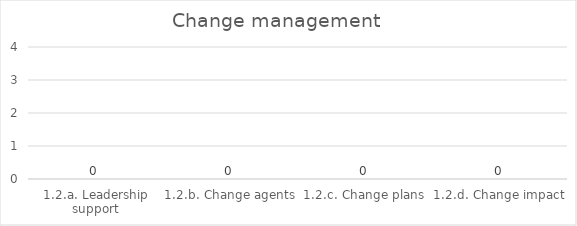
| Category | Change management |
|---|---|
| 1.2.a. Leadership support | 0 |
| 1.2.b. Change agents | 0 |
| 1.2.c. Change plans | 0 |
| 1.2.d. Change impact | 0 |